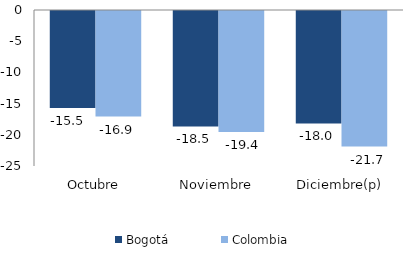
| Category | Bogotá | Colombia |
|---|---|---|
| Octubre | -15.536 | -16.925 |
| Noviembre | -18.508 | -19.384 |
| Diciembre(p) | -18.011 | -21.729 |